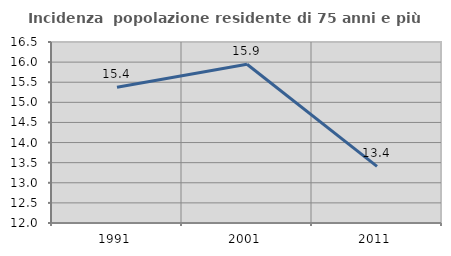
| Category | Incidenza  popolazione residente di 75 anni e più |
|---|---|
| 1991.0 | 15.377 |
| 2001.0 | 15.948 |
| 2011.0 | 13.406 |